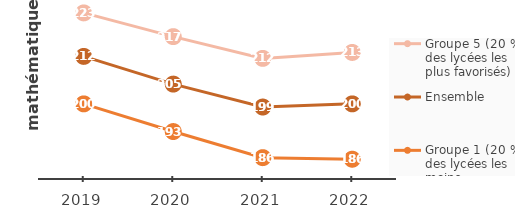
| Category | Groupe 5 (20 % des lycées les plus favorisés) | Ensemble | Groupe 1 (20 % des lycées les moins favorisés) |
|---|---|---|---|
| 2019.0 | 223 | 212 | 200 |
| 2020.0 | 217 | 205 | 193 |
| 2021.0 | 211.5 | 199.2 | 186.4 |
| 2022.0 | 213 | 200 | 186 |